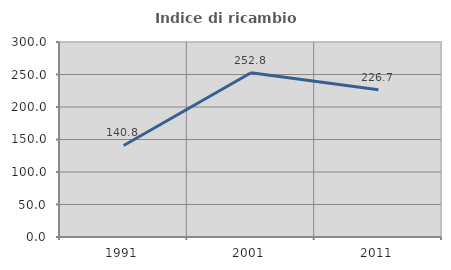
| Category | Indice di ricambio occupazionale  |
|---|---|
| 1991.0 | 140.816 |
| 2001.0 | 252.778 |
| 2011.0 | 226.667 |